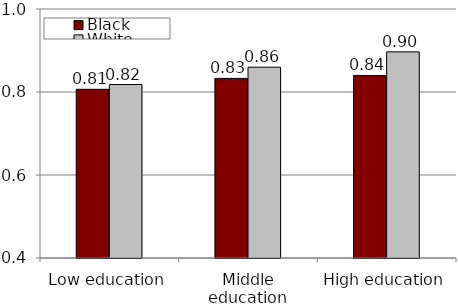
| Category | Black | White |
|---|---|---|
| Low education | 0.806 | 0.818 |
| Middle education | 0.833 | 0.86 |
| High education | 0.84 | 0.897 |